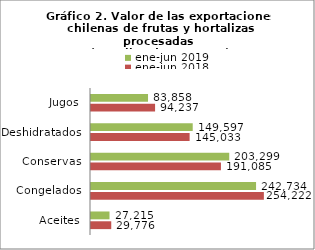
| Category | ene-jun 2018 | ene-jun 2019 |
|---|---|---|
| Aceites | 29775586.73 | 27214758.66 |
| Congelados | 254221618.91 | 242733594.67 |
| Conservas | 191084946.69 | 203298761.44 |
| Deshidratados | 145032624.15 | 149596720.35 |
| Jugos | 94237243.21 | 83858050.85 |